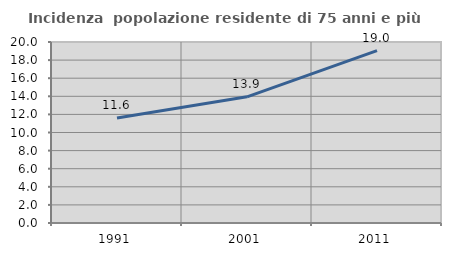
| Category | Incidenza  popolazione residente di 75 anni e più |
|---|---|
| 1991.0 | 11.594 |
| 2001.0 | 13.941 |
| 2011.0 | 19.038 |